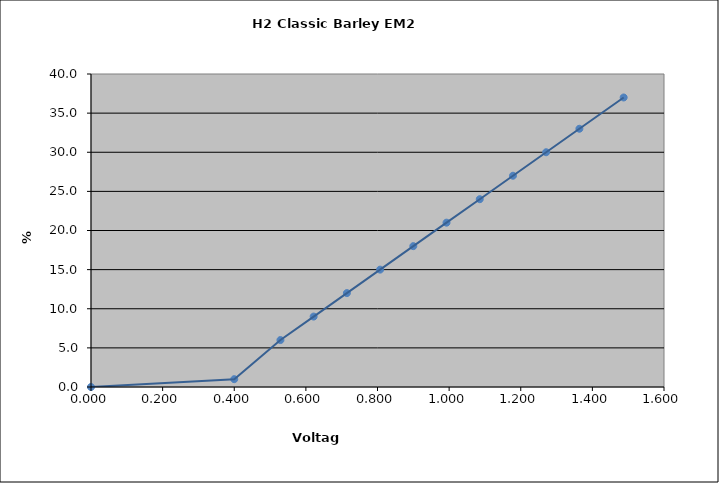
| Category | Generated Curve |
|---|---|
| 0.0 | 0 |
| 0.4 | 1 |
| 0.529 | 6 |
| 0.62175 | 9 |
| 0.7145 | 12 |
| 0.80725 | 15 |
| 0.9 | 18 |
| 0.99275 | 21 |
| 1.0855000000000001 | 24 |
| 1.17825 | 27 |
| 1.2710000000000001 | 30 |
| 1.36375 | 33 |
| 1.4874166666666668 | 37 |